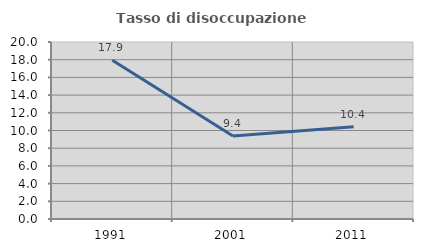
| Category | Tasso di disoccupazione giovanile  |
|---|---|
| 1991.0 | 17.949 |
| 2001.0 | 9.375 |
| 2011.0 | 10.417 |